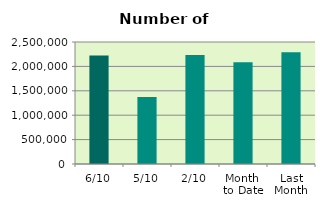
| Category | Series 0 |
|---|---|
| 6/10 | 2225790 |
| 5/10 | 1373928 |
| 2/10 | 2232744 |
| Month 
to Date | 2087391 |
| Last
Month | 2288803 |